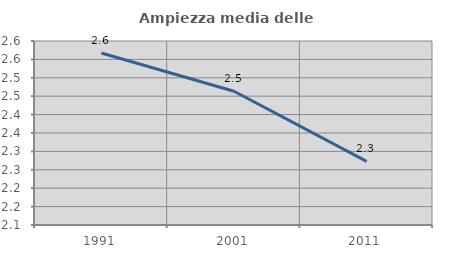
| Category | Ampiezza media delle famiglie |
|---|---|
| 1991.0 | 2.567 |
| 2001.0 | 2.463 |
| 2011.0 | 2.273 |